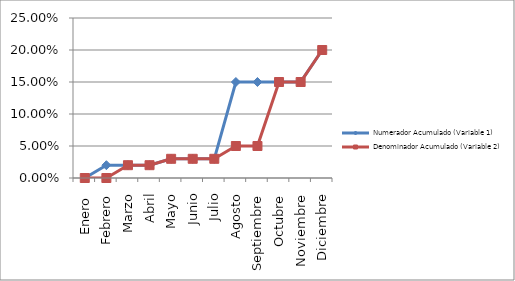
| Category | Numerador Acumulado (Variable 1) | Denominador Acumulado (Variable 2) |
|---|---|---|
| Enero  | 0 | 0 |
| Febrero | 0.02 | 0 |
| Marzo | 0.02 | 0.02 |
| Abril | 0.02 | 0.02 |
| Mayo | 0.03 | 0.03 |
| Junio | 0.03 | 0.03 |
| Julio | 0.03 | 0.03 |
| Agosto | 0.15 | 0.05 |
| Septiembre | 0.15 | 0.05 |
| Octubre | 0.15 | 0.15 |
| Noviembre | 0.15 | 0.15 |
| Diciembre | 0.2 | 0.2 |